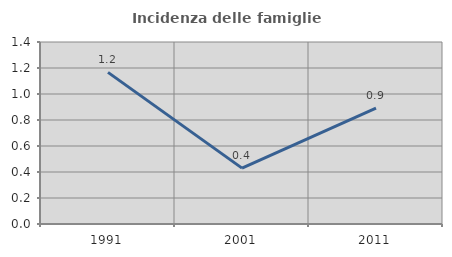
| Category | Incidenza delle famiglie numerose |
|---|---|
| 1991.0 | 1.166 |
| 2001.0 | 0.43 |
| 2011.0 | 0.891 |